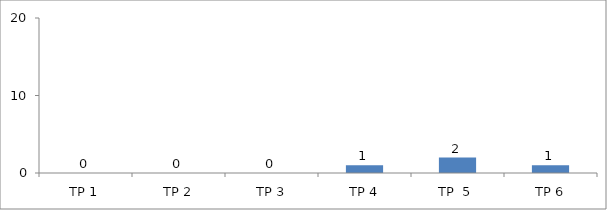
| Category | BIL. MURID |
|---|---|
| TP 1 | 0 |
| TP 2 | 0 |
|  TP 3 | 0 |
| TP 4 | 1 |
| TP  5 | 2 |
| TP 6 | 1 |